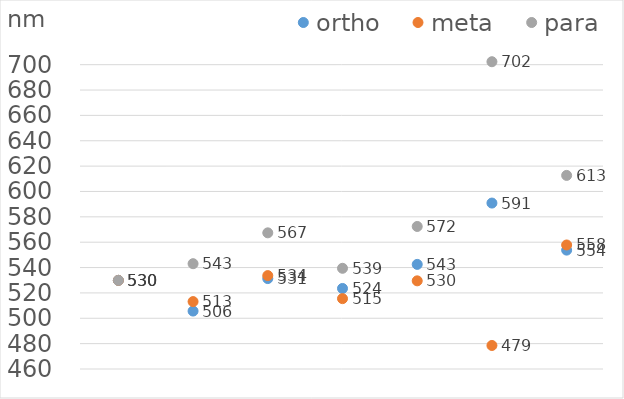
| Category | ortho | meta | para |
|---|---|---|---|
| 0 | 529.91 | 529.91 | 529.91 |
| 1 | 505.68 | 513.16 | 543.05 |
| 2 | 531.31 | 533.66 | 567.38 |
| 3 | 523.52 | 515.49 | 539.43 |
| 4 | 542.5 | 529.53 | 572.41 |
| 5 | 590.86 | 478.55 | 702.33 |
| 6 | 553.74 | 557.81 | 612.68 |